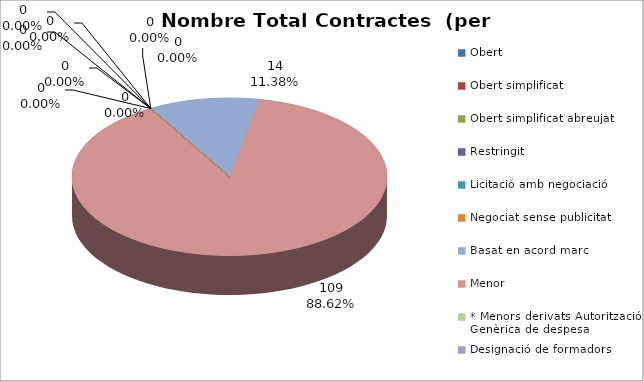
| Category | Nombre Total Contractes |
|---|---|
| Obert | 0 |
| Obert simplificat | 0 |
| Obert simplificat abreujat | 0 |
| Restringit | 0 |
| Licitació amb negociació | 0 |
| Negociat sense publicitat | 0 |
| Basat en acord marc | 14 |
| Menor | 109 |
| * Menors derivats Autorització Genèrica de despesa | 0 |
| Designació de formadors | 0 |